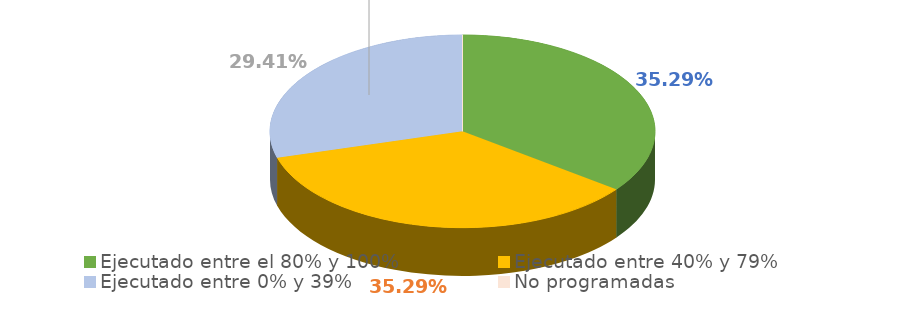
| Category | Series 0 |
|---|---|
| Ejecutado entre el 80% y 100% | 0.353 |
| Ejecutado entre 40% y 79% | 0.353 |
| Ejecutado entre 0% y 39% | 0.294 |
| No programadas | 0 |